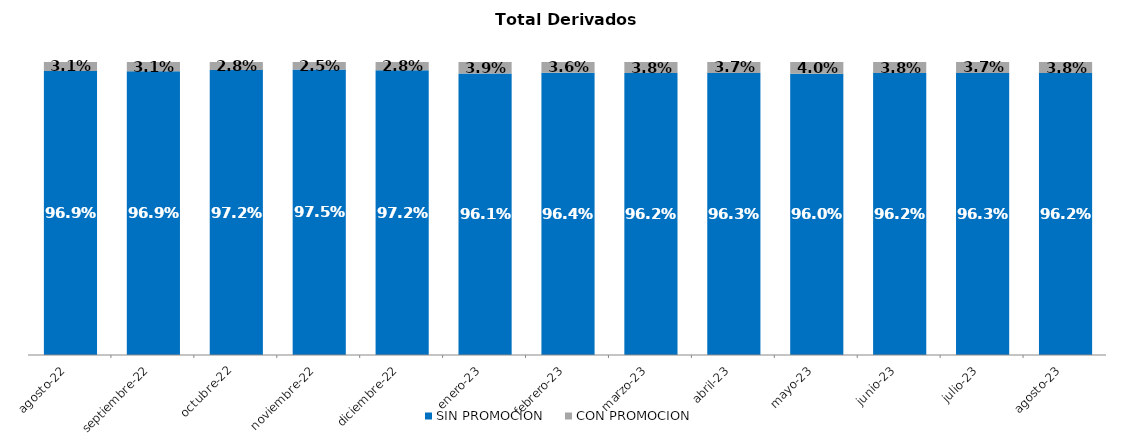
| Category | SIN PROMOCION   | CON PROMOCION   |
|---|---|---|
| 2022-08-01 | 0.969 | 0.031 |
| 2022-09-01 | 0.969 | 0.031 |
| 2022-10-01 | 0.972 | 0.028 |
| 2022-11-01 | 0.975 | 0.025 |
| 2022-12-01 | 0.972 | 0.028 |
| 2023-01-01 | 0.961 | 0.039 |
| 2023-02-01 | 0.964 | 0.036 |
| 2023-03-01 | 0.962 | 0.038 |
| 2023-04-01 | 0.963 | 0.037 |
| 2023-05-01 | 0.96 | 0.04 |
| 2023-06-01 | 0.962 | 0.038 |
| 2023-07-01 | 0.963 | 0.037 |
| 2023-08-01 | 0.962 | 0.038 |